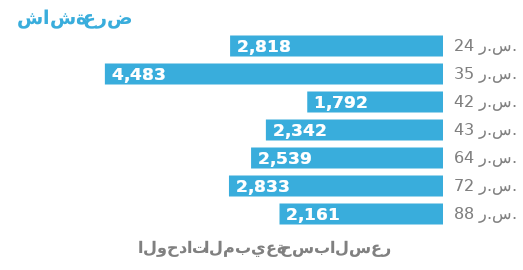
| Category | Series 0 |
|---|---|
| 24.0 | 2818 |
| 35.0 | 4483 |
| 42.0 | 1792 |
| 43.0 | 2342 |
| 64.0 | 2539 |
| 72.0 | 2833 |
| 88.0 | 2161 |